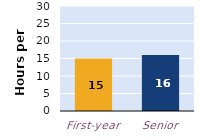
| Category | hours per week |
|---|---|
| First-year | 15 |
| Senior | 16 |